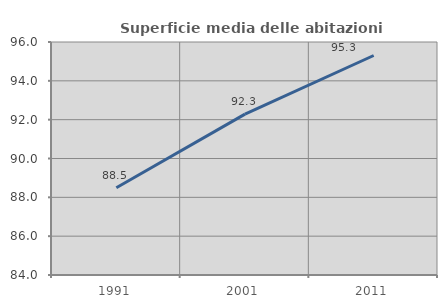
| Category | Superficie media delle abitazioni occupate |
|---|---|
| 1991.0 | 88.496 |
| 2001.0 | 92.284 |
| 2011.0 | 95.305 |